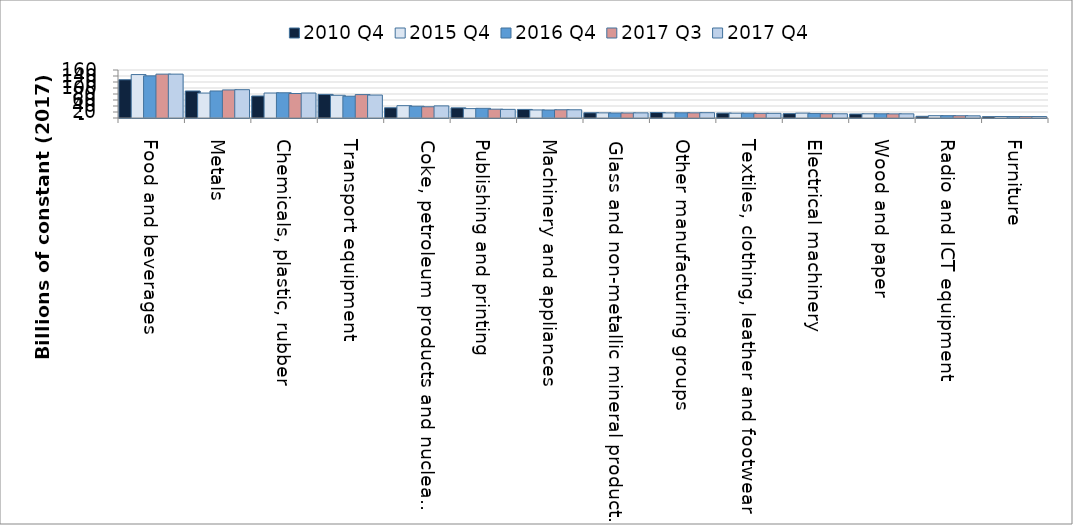
| Category |  2010 Q4  |  2015 Q4  |  2016 Q4  | 2017 Q3 | 2017 Q4 |
|---|---|---|---|---|---|
|  Food and beverages  | 127.576 | 144.778 | 140.477 | 146.211 | 146.211 |
|  Metals  | 90.083 | 83.154 | 90.083 | 93.548 | 94.414 |
|  Chemicals, plastic, rubber  | 73.361 | 83.252 | 84.077 | 81.604 | 83.252 |
|  Transport equipment  | 78.779 | 75.72 | 72.66 | 78.014 | 76.484 |
|  Coke, petroleum products and nuclear fuel  | 34.163 | 41.142 | 39.306 | 37.469 | 40.408 |
|  Publishing and printing  | 33.83 | 31.301 | 32.249 | 29.404 | 28.771 |
|  Machinery and appliances  | 28.554 | 26.875 | 26.595 | 27.435 | 27.435 |
|  Glass and non-metallic mineral products  | 17.447 | 17.102 | 16.583 | 16.583 | 17.102 |
|  Other manufacturing groups  | 18.39 | 16.989 | 17.339 | 17.164 | 17.69 |
|  Textiles, clothing, leather and footwear  | 16.364 | 16.037 | 16.037 | 15.546 | 15.546 |
|  Electrical machinery  | 14.571 | 16.295 | 15.198 | 14.258 | 14.101 |
|  Wood and paper  | 13.328 | 14.022 | 14.022 | 13.745 | 13.884 |
|  Radio and ICT equipment  | 5.7 | 7.72 | 7.792 | 7.503 | 7.287 |
|  Furniture  | 4.562 | 4.913 | 4.813 | 4.712 | 4.813 |